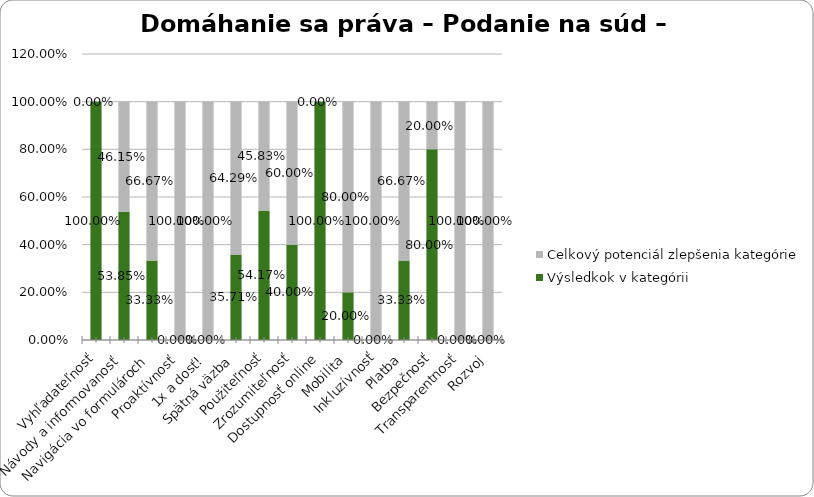
| Category | Výsledkok v kategórii | Celkový potenciál zlepšenia kategórie |
|---|---|---|
| Vyhľadateľnosť | 1 | 0 |
| Návody a informovanosť | 0.538 | 0.462 |
| Navigácia vo formulároch | 0.333 | 0.667 |
| Proaktívnosť | 0 | 1 |
| 1x a dosť! | 0 | 1 |
| Spätná väzba | 0.357 | 0.643 |
| Použiteľnosť | 0.542 | 0.458 |
| Zrozumiteľnosť | 0.4 | 0.6 |
| Dostupnosť online | 1 | 0 |
| Mobilita | 0.2 | 0.8 |
| Inkluzívnosť | 0 | 1 |
| Platba | 0.333 | 0.667 |
| Bezpečnosť | 0.8 | 0.2 |
| Transparentnosť | 0 | 1 |
| Rozvoj | 0 | 1 |